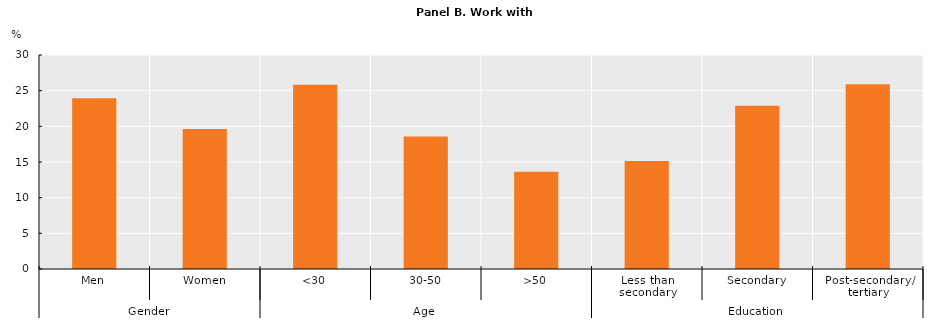
| Category | Computer - How often - Spreadsheets |
|---|---|
| 0 | 23.931 |
| 1 | 19.639 |
| 2 | 25.833 |
| 3 | 18.581 |
| 4 | 13.648 |
| 5 | 15.15 |
| 6 | 22.873 |
| 7 | 25.906 |